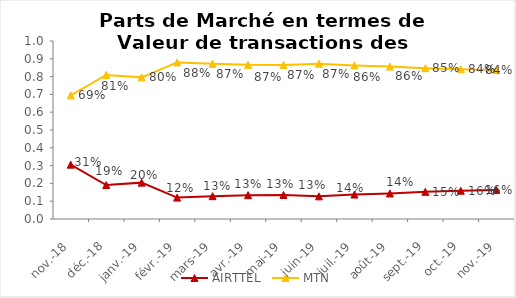
| Category | AIRTTEL | MTN |
|---|---|---|
| nov.-18 | 0.305 | 0.695 |
| déc.-18 | 0.191 | 0.809 |
| janv.-19 | 0.204 | 0.796 |
| févr.-19 | 0.12 | 0.88 |
| mars-19 | 0.128 | 0.872 |
| avr.-19 | 0.134 | 0.866 |
| mai-19 | 0.135 | 0.865 |
| juin-19 | 0.127 | 0.873 |
| juil.-19 | 0.137 | 0.863 |
| août-19 | 0.144 | 0.856 |
| sept.-19 | 0.153 | 0.847 |
| oct.-19 | 0.159 | 0.841 |
| nov.-19 | 0.163 | 0.837 |